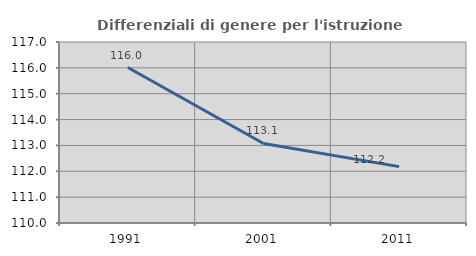
| Category | Differenziali di genere per l'istruzione superiore |
|---|---|
| 1991.0 | 116.011 |
| 2001.0 | 113.076 |
| 2011.0 | 112.18 |